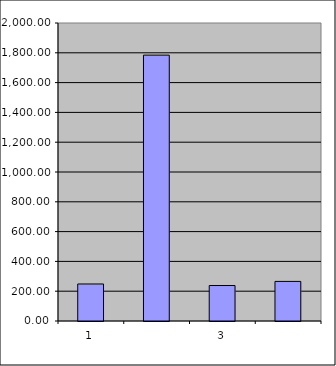
| Category | Series 0 |
|---|---|
| 0 | 248.5 |
| 1 | 1784.382 |
| 2 | 238.128 |
| 3 | 265.724 |